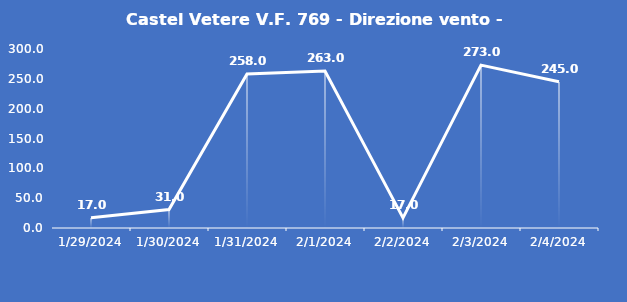
| Category | Castel Vetere V.F. 769 - Direzione vento - Grezzo (°N) |
|---|---|
| 1/29/24 | 17 |
| 1/30/24 | 31 |
| 1/31/24 | 258 |
| 2/1/24 | 263 |
| 2/2/24 | 17 |
| 2/3/24 | 273 |
| 2/4/24 | 245 |